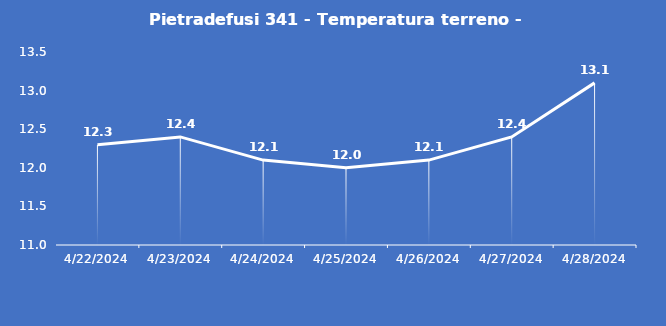
| Category | Pietradefusi 341 - Temperatura terreno - Grezzo (°C) |
|---|---|
| 4/22/24 | 12.3 |
| 4/23/24 | 12.4 |
| 4/24/24 | 12.1 |
| 4/25/24 | 12 |
| 4/26/24 | 12.1 |
| 4/27/24 | 12.4 |
| 4/28/24 | 13.1 |